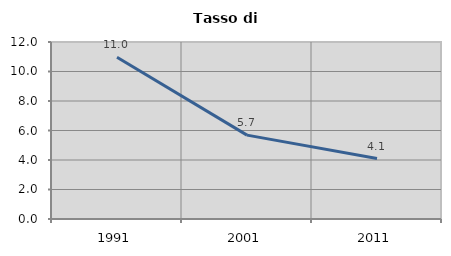
| Category | Tasso di disoccupazione   |
|---|---|
| 1991.0 | 10.963 |
| 2001.0 | 5.686 |
| 2011.0 | 4.1 |